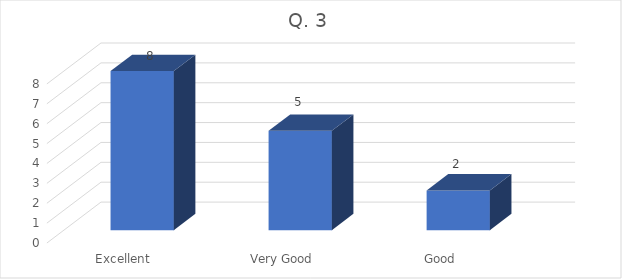
| Category | Series 0 |
|---|---|
| Excellent  | 8 |
| Very Good | 5 |
| Good | 2 |